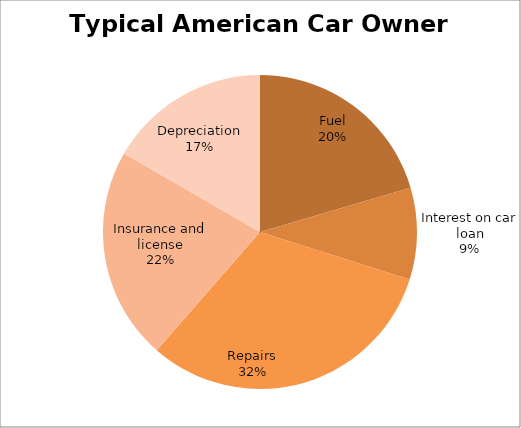
| Category | Series 0 |
|---|---|
| Fuel | 603 |
| Interest on car loan | 279 |
| Repairs | 930 |
| Insurance and license | 646 |
| Depreciation | 492 |